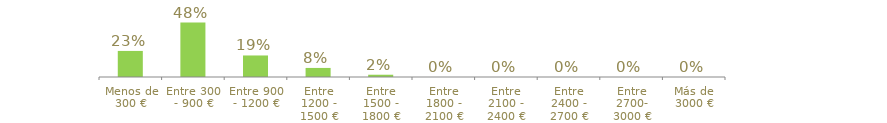
| Category | Series 0 |
|---|---|
| Menos de 300 € | 0.23 |
| Entre 300 - 900 € | 0.48 |
| Entre 900 - 1200 € | 0.19 |
| Entre 1200 - 1500 € | 0.08 |
| Entre 1500 - 1800 € | 0.02 |
| Entre 1800 - 2100 € | 0 |
| Entre 2100 - 2400 € | 0 |
| Entre 2400 - 2700 € | 0 |
| Entre 2700- 3000 € | 0 |
| Más de 3000 € | 0 |